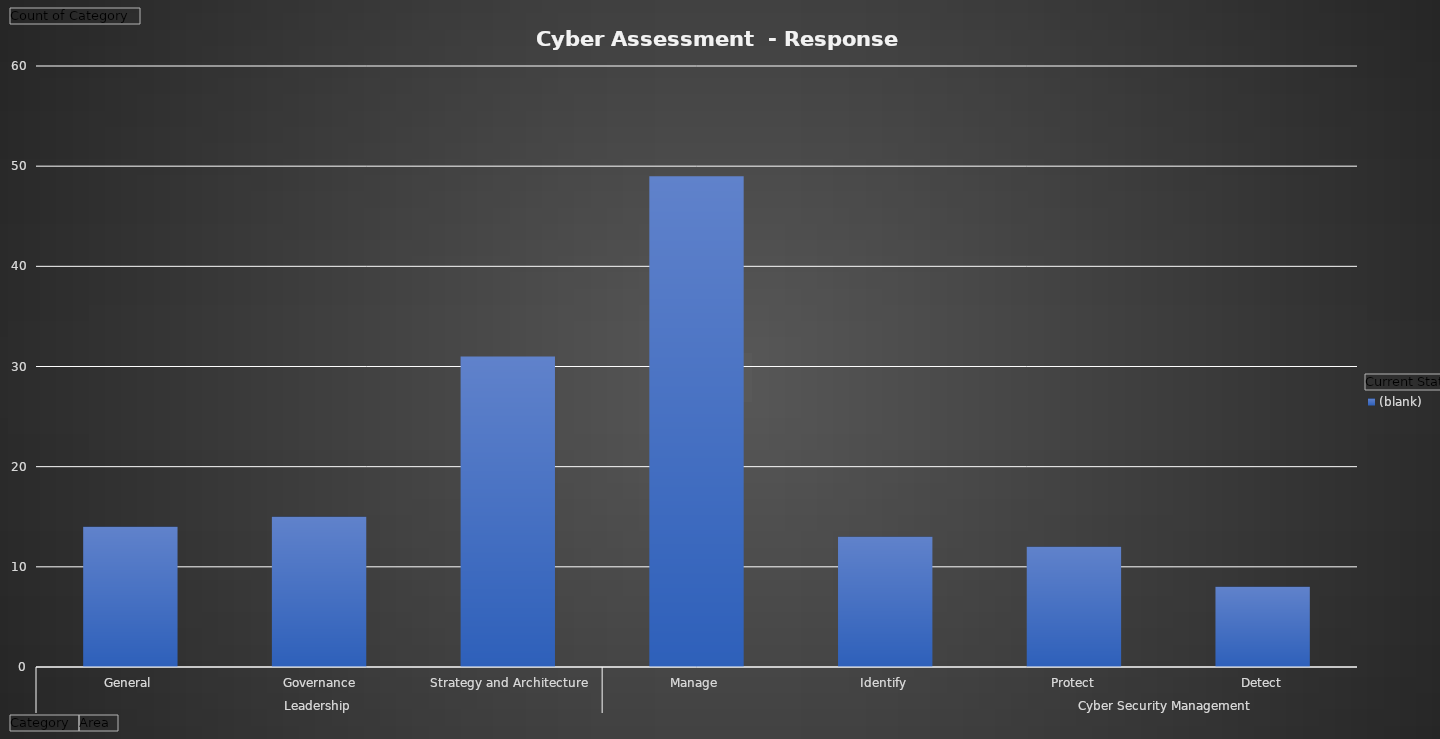
| Category | (blank) |
|---|---|
| 0 | 14 |
| 1 | 15 |
| 2 | 31 |
| 3 | 49 |
| 4 | 13 |
| 5 | 12 |
| 6 | 8 |